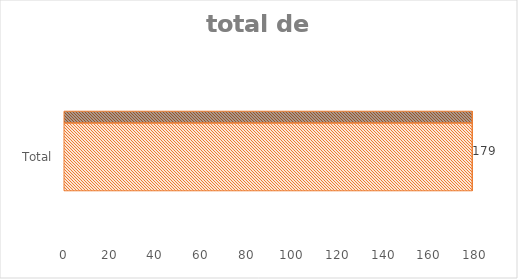
| Category | Total |
|---|---|
| Total | 179 |